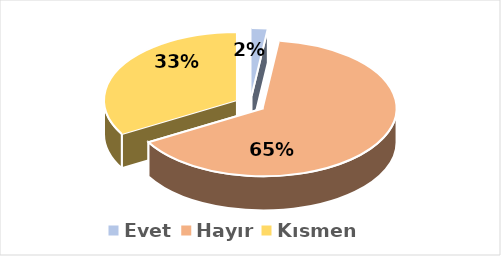
| Category | Evet |
|---|---|
| Evet | 0.02 |
| Hayır | 0.647 |
| Kısmen | 0.333 |